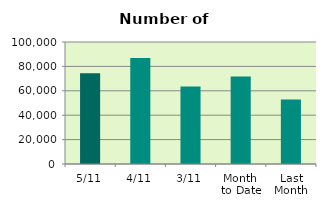
| Category | Series 0 |
|---|---|
| 5/11 | 74372 |
| 4/11 | 86828 |
| 3/11 | 63562 |
| Month 
to Date | 71815 |
| Last
Month | 52845 |